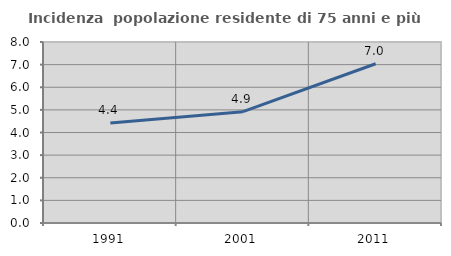
| Category | Incidenza  popolazione residente di 75 anni e più |
|---|---|
| 1991.0 | 4.415 |
| 2001.0 | 4.919 |
| 2011.0 | 7.04 |